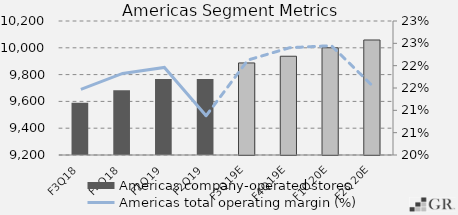
| Category | Americas company-operated stores |
|---|---|
|  F3Q18  | 9590 |
|  F4Q18  | 9684 |
|  F1Q19  | 9768 |
|  F2Q19  | 9767 |
|  F3Q19E  | 9887 |
|  F4Q19E  | 9937 |
|  F1Q20E  | 10000.25 |
|  F2Q20E  | 10058.312 |